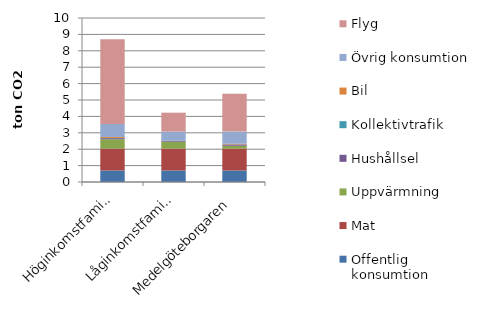
| Category | Offentlig konsumtion | Mat | Uppvärmning | Hushållsel | Kollektivtrafik | Bil | Övrig konsumtion | Flyg |
|---|---|---|---|---|---|---|---|---|
| Höginkomstfamilj | 0.705 | 1.331 | 0.571 | 0.067 | 0.013 | 0.055 | 0.8 | 5.16 |
| Låginkomstfamilj | 0.705 | 1.331 | 0.421 | 0.06 | 0.02 | 0 | 0.539 | 1.152 |
| Medelgöteborgaren | 0.705 | 1.331 | 0.173 | 0.08 | 0.006 | 0.039 | 0.739 | 2.303 |